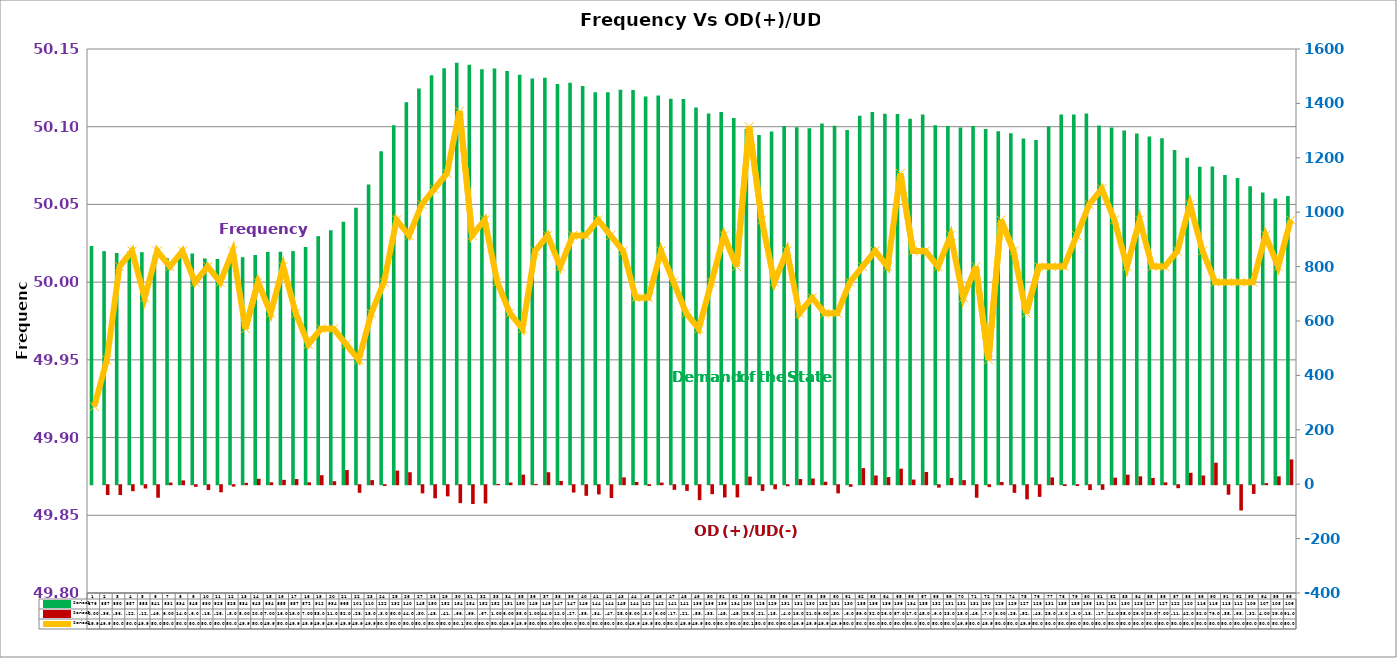
| Category | Series 2 | Series 4 |
|---|---|---|
| 0 | 876 | 0 |
| 1 | 857 | -36 |
| 2 | 850 | -36 |
| 3 | 857 | -22 |
| 4 | 853 | -12 |
| 5 | 841 | -46 |
| 6 | 831 | 6 |
| 7 | 834 | 14 |
| 8 | 848 | -6 |
| 9 | 830 | -18 |
| 10 | 828 | -26 |
| 11 | 828 | -5 |
| 12 | 834 | 5 |
| 13 | 843 | 20 |
| 14 | 854 | 7 |
| 15 | 855 | 16 |
| 16 | 857 | 19 |
| 17 | 872 | 7 |
| 18 | 912 | 33 |
| 19 | 934 | 11 |
| 20 | 965 | 52 |
| 21 | 1016 | -28 |
| 22 | 1102 | 15 |
| 23 | 1224 | -3 |
| 24 | 1320 | 50 |
| 25 | 1404 | 44 |
| 26 | 1455 | -30 |
| 27 | 1503.2 | -48 |
| 28 | 1529 | -41 |
| 29 | 1549 | -66 |
| 30 | 1542 | -69 |
| 31 | 1526 | -67 |
| 32 | 1528 | 1 |
| 33 | 1519 | 6 |
| 34 | 1505 | 35 |
| 35 | 1492 | 1 |
| 36 | 1494 | 44 |
| 37 | 1471 | 12 |
| 38 | 1476 | -27 |
| 39 | 1464 | -39 |
| 40 | 1441 | -34 |
| 41 | 1441 | -47 |
| 42 | 1450 | 25 |
| 43 | 1449 | 8 |
| 44 | 1425 | -3 |
| 45 | 1429 | 6 |
| 46 | 1417 | -17 |
| 47 | 1416 | -21 |
| 48 | 1385 | -55 |
| 49 | 1363 | -33 |
| 50 | 1368 | -45 |
| 51 | 1346 | -45 |
| 52 | 1306 | 28 |
| 53 | 1284 | -21 |
| 54 | 1297 | -15 |
| 55 | 1317 | -4 |
| 56 | 1312 | 19 |
| 57 | 1309 | 21 |
| 58 | 1326 | 9 |
| 59 | 1318 | -30 |
| 60 | 1302 | -6 |
| 61 | 1355 | 59 |
| 62 | 1368 | 32 |
| 63 | 1362 | 26 |
| 64 | 1361 | 57 |
| 65 | 1344 | 17 |
| 66 | 1359 | 45 |
| 67 | 1320 | -9 |
| 68 | 1317 | 23 |
| 69 | 1311 | 15 |
| 70 | 1317 | -46 |
| 71 | 1306 | -7 |
| 72 | 1298 | 8 |
| 73 | 1290 | -28 |
| 74 | 1271 | -52 |
| 75 | 1265 | -43 |
| 76 | 1315 | 25 |
| 77 | 1359 | -3 |
| 78 | 1359 | -3 |
| 79 | 1363 | -18 |
| 80 | 1319 | -17 |
| 81 | 1311 | 24 |
| 82 | 1300 | 35 |
| 83 | 1289 | 29 |
| 84 | 1278 | 23 |
| 85 | 1272 | 7 |
| 86 | 1229 | -11 |
| 87 | 1200 | 42 |
| 88 | 1167 | 32 |
| 89 | 1168 | 79 |
| 90 | 1137 | -35 |
| 91 | 1126 | -93 |
| 92 | 1095 | -32 |
| 93 | 1072 | 4 |
| 94 | 1050 | 29 |
| 95 | 1060 | 91 |